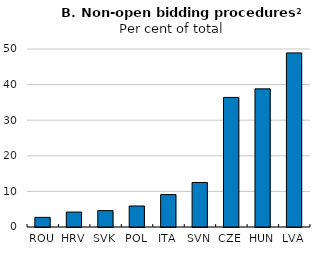
| Category | Series 0 |
|---|---|
| ROU | 2.7 |
| HRV | 4.2 |
| SVK | 4.6 |
| POL | 5.9 |
| ITA | 9.1 |
| SVN | 12.5 |
| CZE | 36.4 |
| HUN | 38.8 |
| LVA | 48.9 |